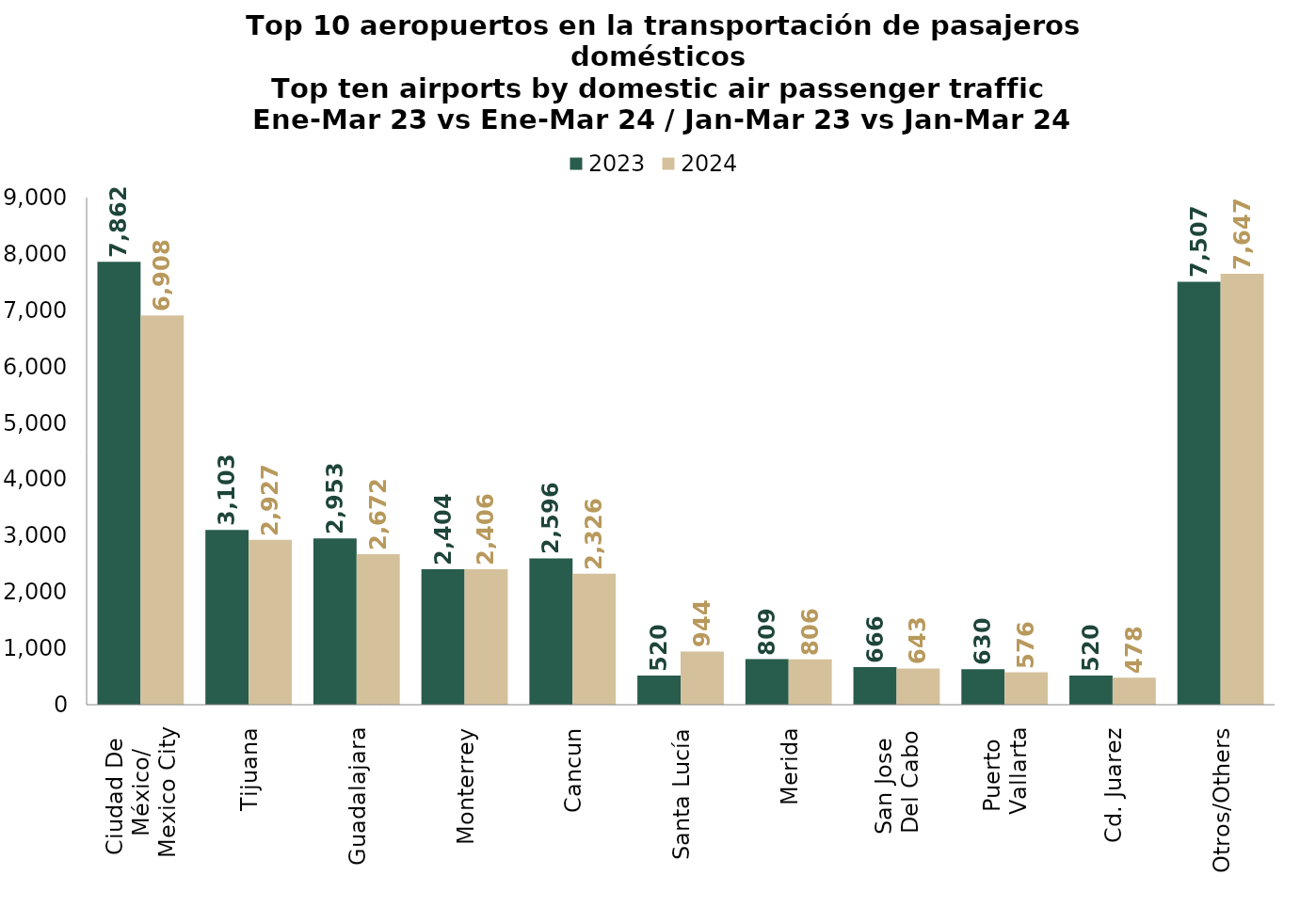
| Category | 2023 | 2024 |
|---|---|---|
| Ciudad De 
México/
Mexico City | 7861.747 | 6908.41 |
| Tijuana | 3103.12 | 2927.384 |
| Guadalajara | 2952.785 | 2672.076 |
| Monterrey | 2404.134 | 2406.363 |
| Cancun | 2596.48 | 2325.909 |
| Santa Lucía | 519.62 | 944.039 |
| Merida | 809.32 | 806.297 |
| San Jose 
Del Cabo | 666.34 | 643.413 |
| Puerto 
Vallarta | 629.633 | 575.704 |
| Cd. Juarez | 519.697 | 478.054 |
| Otros/Others | 7507.421 | 7646.878 |